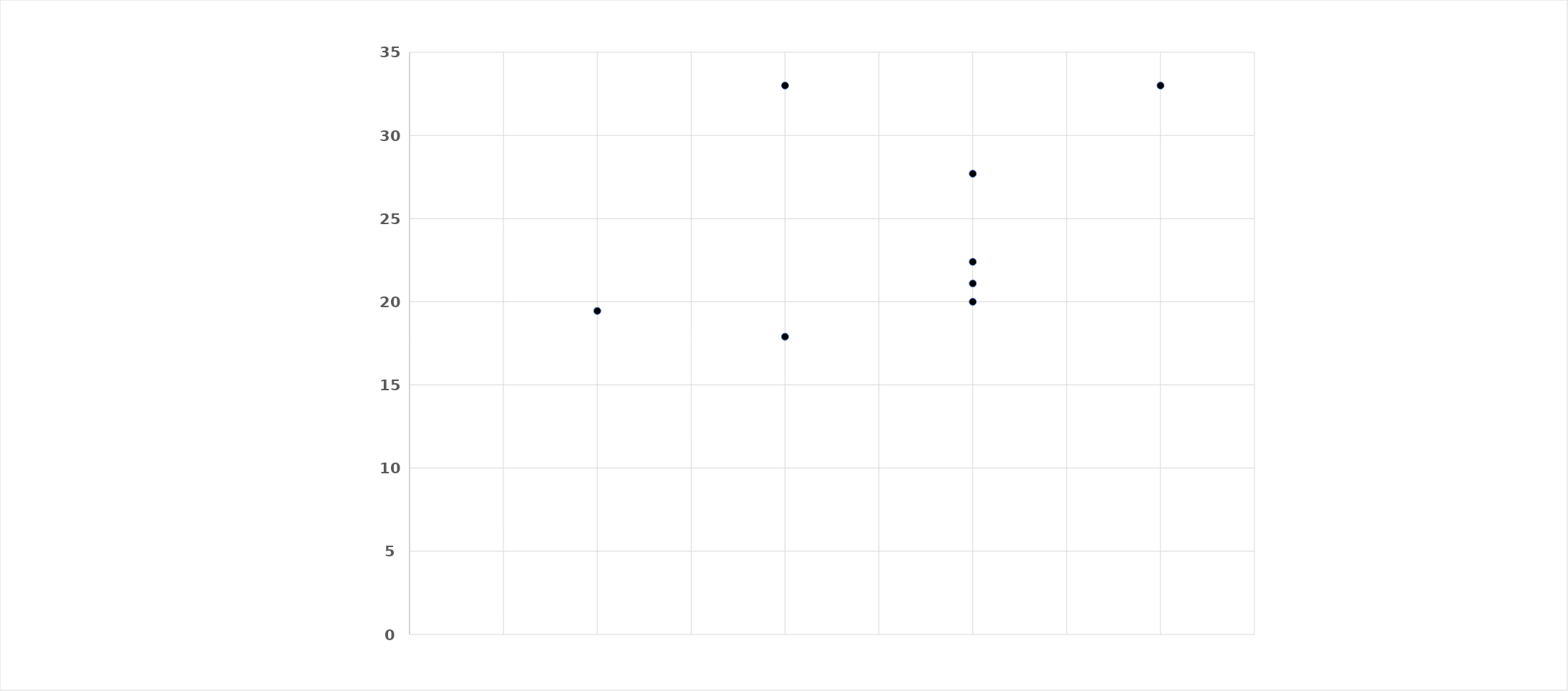
| Category | Series 0 |
|---|---|
| 1.0 | 19.45 |
| 2.0 | 17.9 |
| 3.0 | 20 |
| 3.0 | 27.7 |
| 3.0 | 21.1 |
| 3.0 | 22.4 |
| 2.0 | 33 |
| 4.0 | 33 |